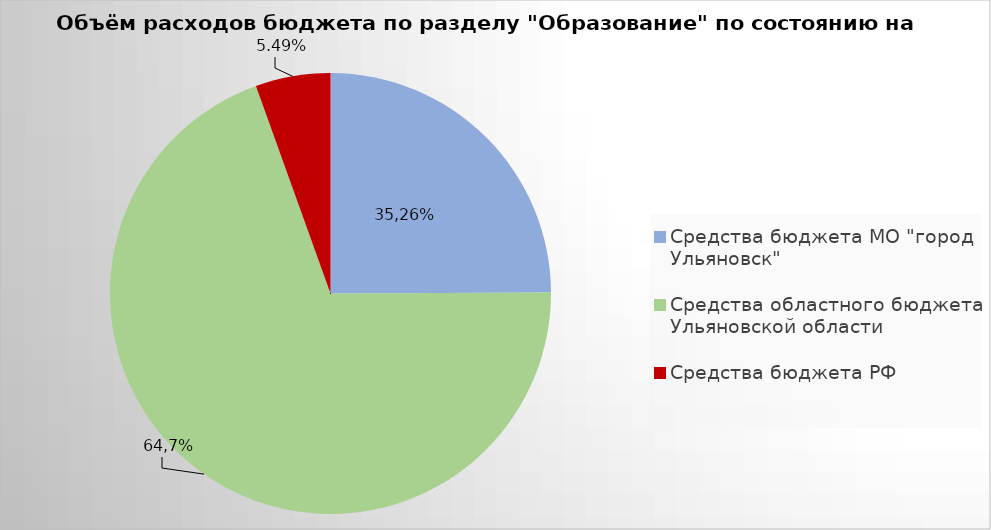
| Category | Series 0 |
|---|---|
| Средства бюджета МО "город Ульяновск" | 2188254.36 |
| Средства областного бюджета Ульяновской области | 6107370.19 |
| Средства бюджета РФ | 481889.61 |